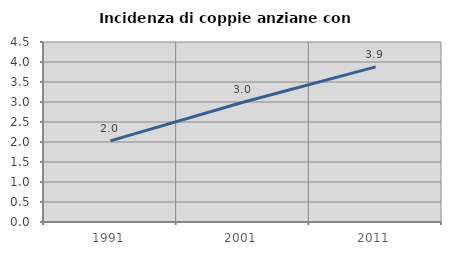
| Category | Incidenza di coppie anziane con figli |
|---|---|
| 1991.0 | 2.028 |
| 2001.0 | 2.994 |
| 2011.0 | 3.878 |